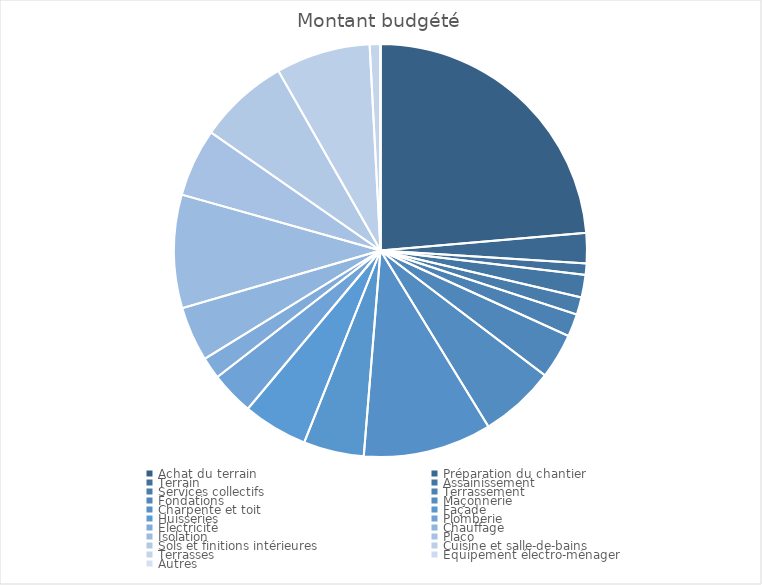
| Category |  Montant budgété  |
|---|---|
| Achat du terrain | 80000 |
| Préparation du chantier | 8000 |
| Terrain | 3000 |
| Assainissement | 6000 |
| Services collectifs | 4600 |
| Terrassement | 6000 |
| Fondations | 12000 |
| Maçonnerie | 20000 |
| Charpente et toit | 34000 |
| Façade | 16000 |
| Huisseries | 17200 |
| Plomberie | 11500 |
| Electricité | 5800 |
| Chauffage | 14500 |
| Isolation | 30000 |
| Placo | 18000 |
| Sols et finitions intérieures | 24000 |
| Cuisine et salle-de-bains | 25000 |
| Terrasses | 2850 |
| Equipement électro-ménager | 0 |
| Autres | 0 |